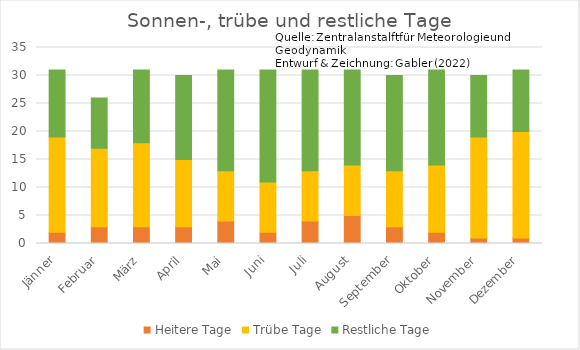
| Category | Heitere Tage | Trübe Tage | Restliche Tage |
|---|---|---|---|
| Jänner | 2 | 17 | 12 |
| Februar | 3 | 14 | 9 |
| März | 3 | 15 | 13 |
| April | 3 | 12 | 15 |
| Mai | 4 | 9 | 18 |
| Juni | 2 | 9 | 20 |
| Juli | 4 | 9 | 18 |
| August | 5 | 9 | 17 |
| September | 3 | 10 | 17 |
| Oktober | 2 | 12 | 17 |
| November | 1 | 18 | 11 |
| Dezember | 1 | 19 | 11 |